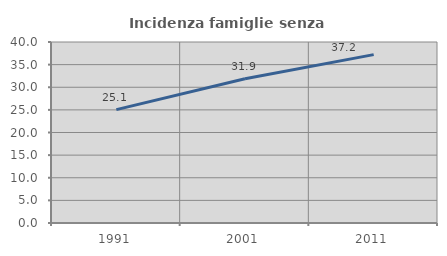
| Category | Incidenza famiglie senza nuclei |
|---|---|
| 1991.0 | 25.057 |
| 2001.0 | 31.884 |
| 2011.0 | 37.213 |